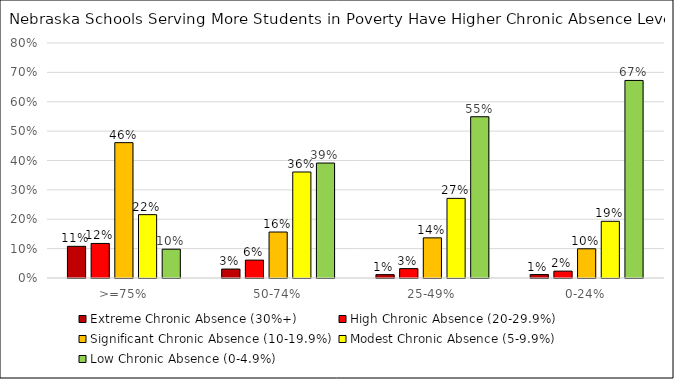
| Category | Extreme Chronic Absence (30%+) | High Chronic Absence (20-29.9%) | Significant Chronic Absence (10-19.9%) | Modest Chronic Absence (5-9.9%) | Low Chronic Absence (0-4.9%) |
|---|---|---|---|---|---|
| >=75% | 0.108 | 0.118 | 0.461 | 0.216 | 0.098 |
| 50-74% | 0.03 | 0.061 | 0.157 | 0.361 | 0.391 |
| 25-49% | 0.011 | 0.032 | 0.137 | 0.271 | 0.549 |
| 0-24% | 0.012 | 0.023 | 0.099 | 0.193 | 0.673 |